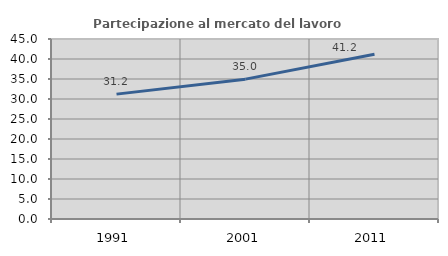
| Category | Partecipazione al mercato del lavoro  femminile |
|---|---|
| 1991.0 | 31.22 |
| 2001.0 | 34.965 |
| 2011.0 | 41.188 |